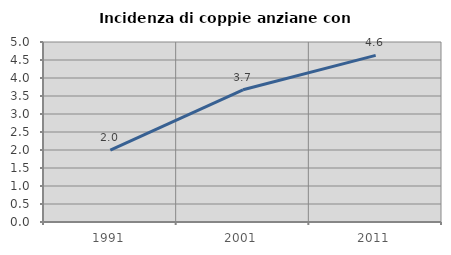
| Category | Incidenza di coppie anziane con figli |
|---|---|
| 1991.0 | 1.996 |
| 2001.0 | 3.672 |
| 2011.0 | 4.63 |